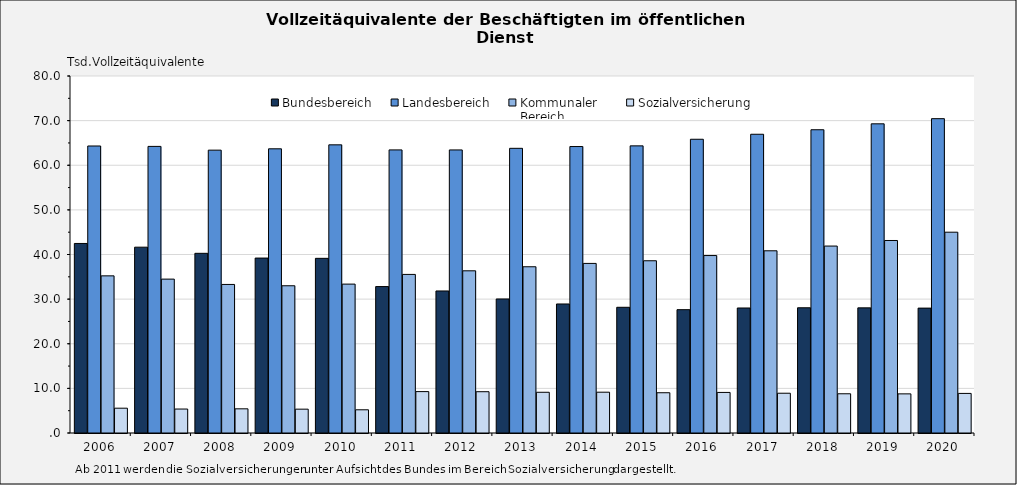
| Category | Bundesbereich | Landesbereich | Kommunaler 
Bereich | Sozialversicherung |
|---|---|---|---|---|
| 2006-12-31 | 42.472 | 64.316 | 35.215 | 5.557 |
| 2007-12-31 | 41.641 | 64.225 | 34.483 | 5.371 |
| 2008-12-31 | 40.266 | 63.383 | 33.289 | 5.42 |
| 2009-12-31 | 39.199 | 63.685 | 32.995 | 5.343 |
| 2010-12-31 | 39.141 | 64.573 | 33.365 | 5.2 |
| 2011-12-31 | 32.813 | 63.44 | 35.538 | 9.276 |
| 2012-12-31 | 31.828 | 63.433 | 36.347 | 9.254 |
| 2013-12-31 | 30.038 | 63.793 | 37.254 | 9.125 |
| 2014-12-31 | 28.914 | 64.194 | 38.001 | 9.144 |
| 2015-12-31 | 28.172 | 64.342 | 38.599 | 9.023 |
| 2016-12-31 | 27.637 | 65.825 | 39.764 | 9.092 |
| 2017-12-31 | 28.012 | 66.946 | 40.83 | 8.912 |
| 2018-12-31 | 28.061 | 67.958 | 41.891 | 8.789 |
| 2019-12-31 | 28.041 | 69.285 | 43.14 | 8.769 |
| 2020-12-31 | 27.985 | 70.44 | 45 | 8.87 |